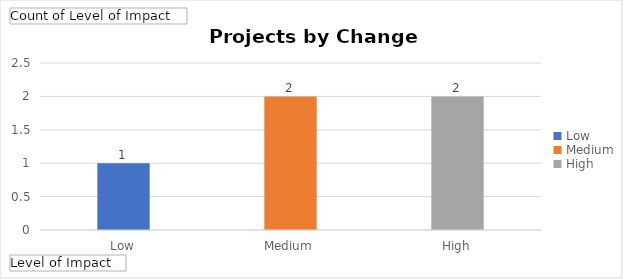
| Category | Total |
|---|---|
| Low | 1 |
| Medium | 2 |
| High | 2 |